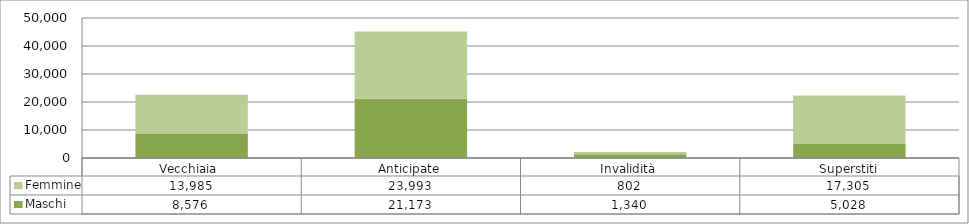
| Category | Maschi | Femmine |
|---|---|---|
| Vecchiaia  | 8576 | 13985 |
| Anticipate | 21173 | 23993 |
| Invalidità | 1340 | 802 |
| Superstiti | 5028 | 17305 |